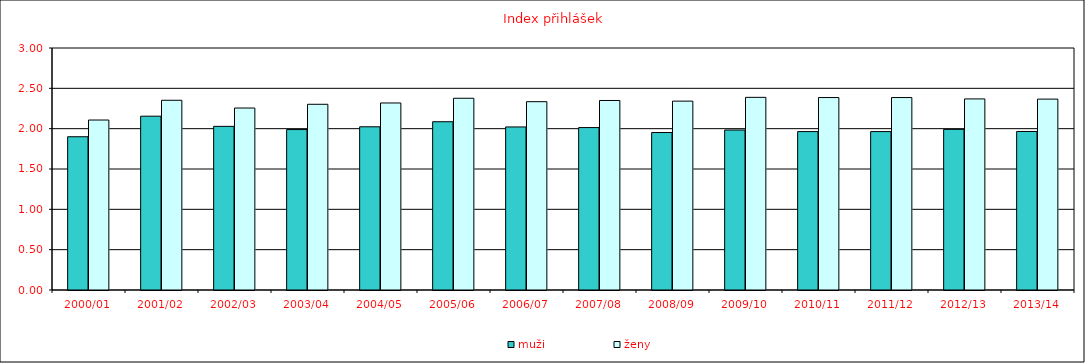
| Category | muži | ženy |
|---|---|---|
| 2000/01 | 1.9 | 2.107 |
| 2001/02 | 2.155 | 2.352 |
| 2002/03 | 2.029 | 2.256 |
| 2003/04 | 1.989 | 2.302 |
| 2004/05 | 2.023 | 2.319 |
| 2005/06 | 2.086 | 2.377 |
| 2006/07 | 2.021 | 2.335 |
| 2007/08 | 2.014 | 2.349 |
| 2008/09 | 1.952 | 2.341 |
| 2009/10 | 1.983 | 2.388 |
| 2010/11 | 1.964 | 2.386 |
| 2011/12 | 1.964 | 2.386 |
| 2012/13 | 1.991 | 2.369 |
| 2013/14 | 1.965 | 2.367 |